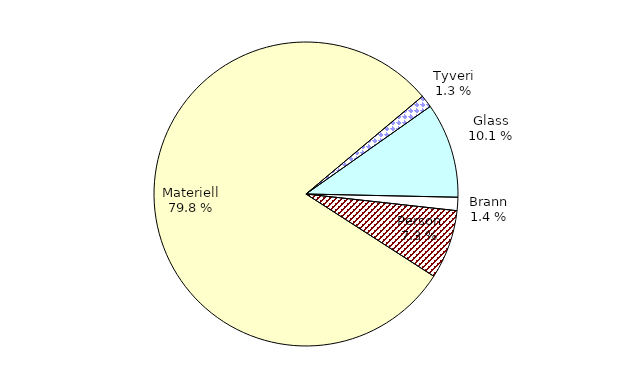
| Category | Series 0 |
|---|---|
| Tyveri | 207.892 |
| Glass | 1567.123 |
| Brann | 219.664 |
| Person | 1139.316 |
| Materiell | 12368.515 |